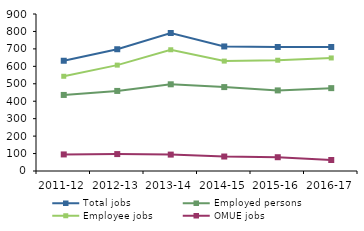
| Category | Total jobs | Employed persons | Employee jobs | OMUE jobs |
|---|---|---|---|---|
| 2011-12 | 632 | 436 | 543 | 95 |
| 2012-13 | 698 | 459 | 607 | 97 |
| 2013-14 | 791 | 497 | 695 | 94 |
| 2014-15 | 714 | 481 | 630 | 83 |
| 2015-16 | 711 | 462 | 635 | 79 |
| 2016-17 | 711 | 475 | 648 | 63 |